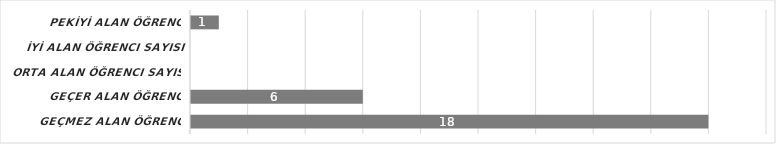
| Category | Series 6 |
|---|---|
| GEÇMEZ alan öğrenci sayısı | 18 |
| GEÇER alan öğrenci sayısı | 6 |
| ORTA alan öğrenci sayısı | 0 |
| İYİ alan öğrenci sayısı | 0 |
| PEKİYİ alan öğrenci sayısı | 1 |